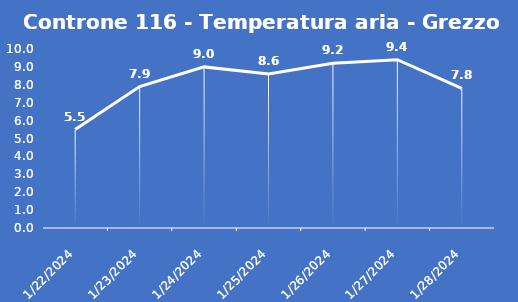
| Category | Controne 116 - Temperatura aria - Grezzo (°C) |
|---|---|
| 1/22/24 | 5.5 |
| 1/23/24 | 7.9 |
| 1/24/24 | 9 |
| 1/25/24 | 8.6 |
| 1/26/24 | 9.2 |
| 1/27/24 | 9.4 |
| 1/28/24 | 7.8 |